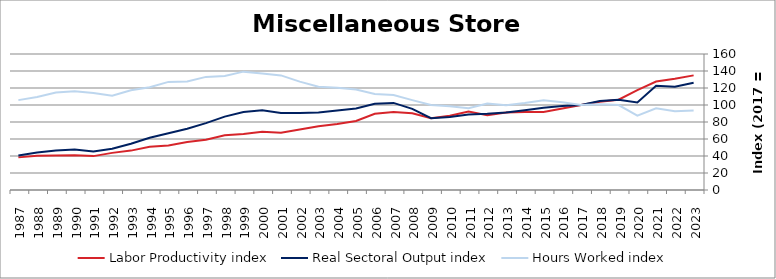
| Category | Labor Productivity index | Real Sectoral Output index | Hours Worked index |
|---|---|---|---|
| 2023.0 | 134.835 | 126.286 | 93.66 |
| 2022.0 | 130.908 | 121.444 | 92.771 |
| 2021.0 | 127.565 | 122.515 | 96.041 |
| 2020.0 | 117.598 | 102.962 | 87.555 |
| 2019.0 | 106.268 | 106.213 | 99.949 |
| 2018.0 | 103.8 | 104.805 | 100.968 |
| 2017.0 | 100 | 100 | 100 |
| 2016.0 | 95.846 | 98.935 | 103.222 |
| 2015.0 | 91.844 | 96.897 | 105.502 |
| 2014.0 | 91.71 | 93.746 | 102.221 |
| 2013.0 | 91.203 | 91.07 | 99.853 |
| 2012.0 | 87.998 | 89.585 | 101.804 |
| 2011.0 | 92.341 | 88.764 | 96.127 |
| 2010.0 | 87.321 | 85.932 | 98.41 |
| 2009.0 | 84.407 | 84.441 | 100.04 |
| 2008.0 | 90.249 | 95.455 | 105.769 |
| 2007.0 | 91.724 | 102.457 | 111.702 |
| 2006.0 | 89.69 | 101.342 | 112.991 |
| 2005.0 | 81.255 | 96.002 | 118.149 |
| 2004.0 | 77.715 | 93.433 | 120.224 |
| 2003.0 | 75.033 | 91.177 | 121.515 |
| 2002.0 | 71.154 | 90.732 | 127.515 |
| 2001.0 | 67.232 | 90.634 | 134.807 |
| 2000.0 | 68.474 | 93.823 | 137.02 |
| 1999.0 | 65.946 | 91.824 | 139.241 |
| 1998.0 | 64.388 | 86.358 | 134.122 |
| 1997.0 | 59.107 | 78.658 | 133.078 |
| 1996.0 | 56.514 | 72.137 | 127.643 |
| 1995.0 | 52.475 | 66.734 | 127.172 |
| 1994.0 | 50.814 | 61.436 | 120.904 |
| 1993.0 | 46.336 | 54.357 | 117.312 |
| 1992.0 | 43.672 | 48.444 | 110.926 |
| 1991.0 | 39.861 | 45.446 | 114.011 |
| 1990.0 | 40.971 | 47.594 | 116.165 |
| 1989.0 | 40.522 | 46.498 | 114.747 |
| 1988.0 | 40.314 | 44.118 | 109.438 |
| 1987.0 | 38.386 | 40.582 | 105.722 |